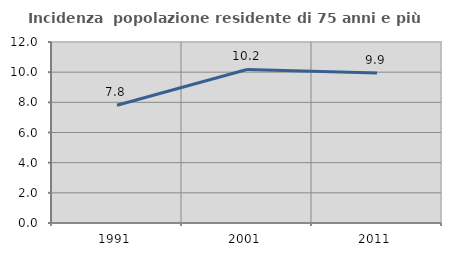
| Category | Incidenza  popolazione residente di 75 anni e più |
|---|---|
| 1991.0 | 7.805 |
| 2001.0 | 10.178 |
| 2011.0 | 9.94 |